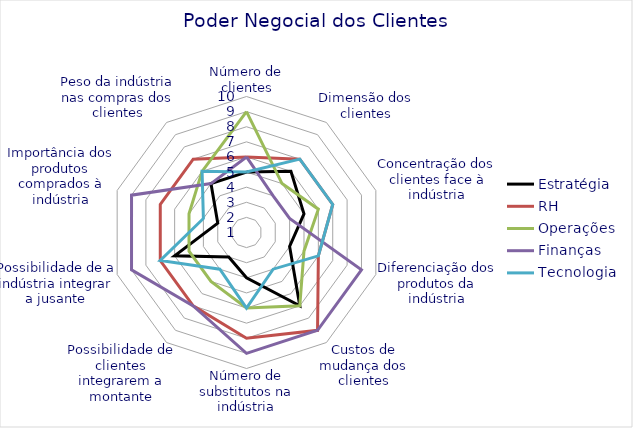
| Category | Estratégia | RH | Operações | Finanças | Tecnologia |
|---|---|---|---|---|---|
| Número de clientes | 5 | 6 | 9 | 6 | 5 |
| Dimensão dos clientes | 6 | 7 | 5 | 4 | 7 |
| Concentração dos clientes face à indústria | 5 | 7 | 6 | 4 | 7 |
| Diferenciação dos produtos da indústria | 4 | 6 | 5 | 9 | 6 |
| Custos de mudança dos clientes | 7 | 9 | 7 | 9 | 4 |
| Número de substitutos na indústria | 4 | 8 | 6 | 9 | 6 |
| Possibilidade de clientes integrarem a montante | 3 | 7 | 5 | 7 | 4 |
| Possibilidade de a indústria integrar a jusante | 6 | 7 | 5 | 9 | 7 |
| Importância dos produtos comprados à indústria | 3 | 7 | 5 | 9 | 4 |
| Peso da indústria nas compras dos clientes | 5 | 7 | 6 | 5 | 6 |